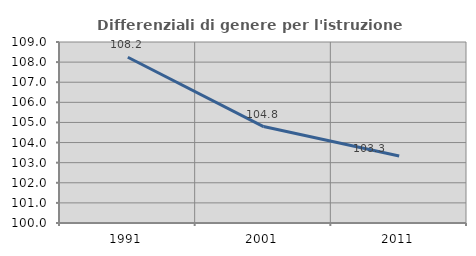
| Category | Differenziali di genere per l'istruzione superiore |
|---|---|
| 1991.0 | 108.242 |
| 2001.0 | 104.796 |
| 2011.0 | 103.333 |